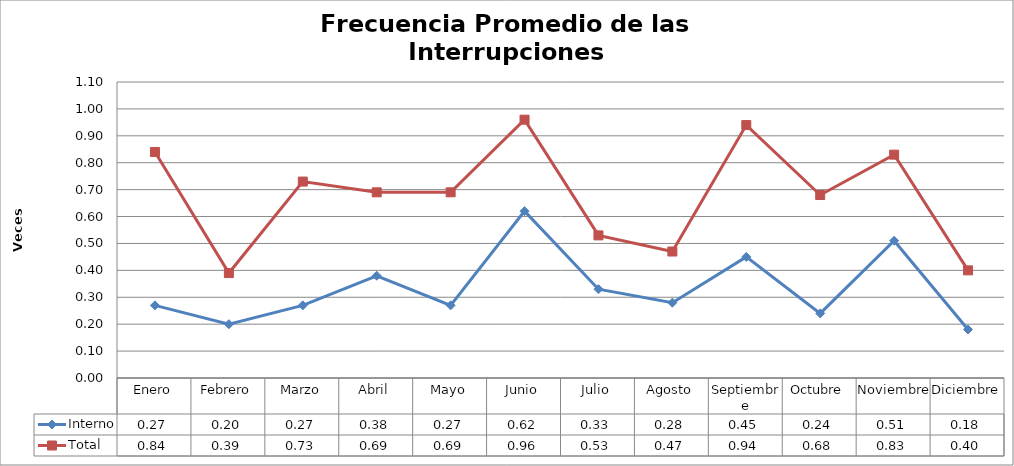
| Category | Interno | Total |
|---|---|---|
| Enero | 0.27 | 0.84 |
| Febrero | 0.2 | 0.39 |
| Marzo | 0.27 | 0.73 |
| Abril | 0.38 | 0.69 |
| Mayo | 0.27 | 0.69 |
| Junio | 0.62 | 0.96 |
| Julio | 0.33 | 0.53 |
| Agosto | 0.28 | 0.47 |
| Septiembre | 0.45 | 0.94 |
| Octubre | 0.24 | 0.68 |
| Noviembre | 0.51 | 0.83 |
| Diciembre | 0.18 | 0.4 |